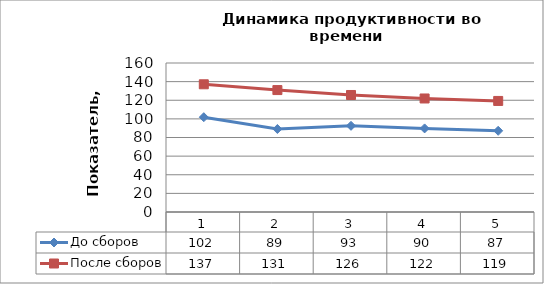
| Category | До сборов | После сборов |
|---|---|---|
| 0 | 101.797 | 137.144 |
| 1 | 89.129 | 130.928 |
| 2 | 92.541 | 125.642 |
| 3 | 89.762 | 121.911 |
| 4 | 87.199 | 119.258 |